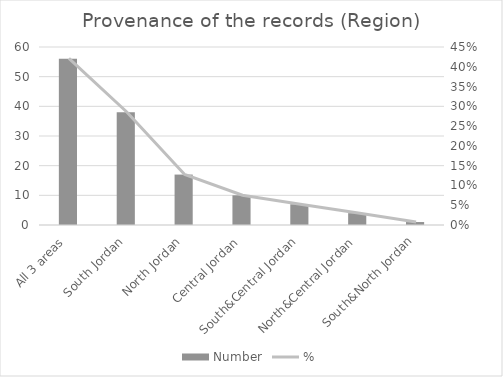
| Category | Number |
|---|---|
| All 3 areas | 56 |
| South Jordan | 38 |
| North Jordan | 17 |
| Central Jordan | 10 |
| South&Central Jordan | 7 |
| North&Central Jordan | 4 |
| South&North Jordan | 1 |